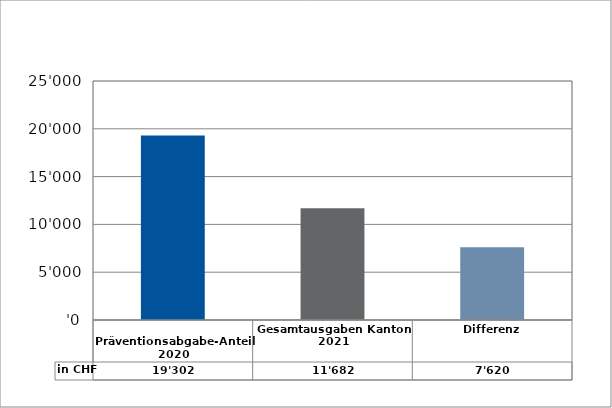
| Category | in CHF |
|---|---|
| 
Präventionsabgabe-Anteil 2020

 | 19302 |
| Gesamtausgaben Kanton 2021
 | 11682.1 |
| Differenz | 7619.9 |